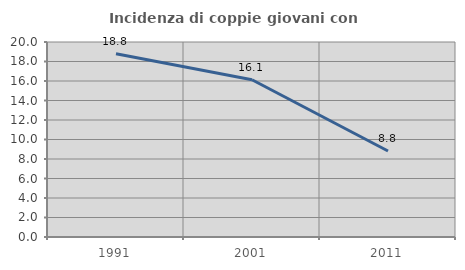
| Category | Incidenza di coppie giovani con figli |
|---|---|
| 1991.0 | 18.788 |
| 2001.0 | 16.129 |
| 2011.0 | 8.824 |